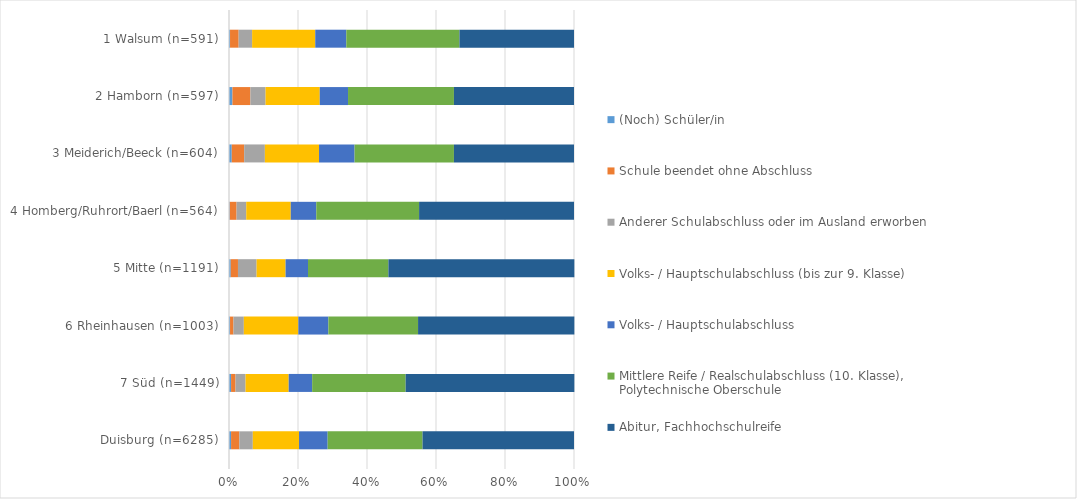
| Category | (Noch) Schüler/in | Schule beendet ohne Abschluss | Anderer Schulabschluss oder im Ausland erworben | Volks- / Hauptschulabschluss (bis zur 9. Klasse) | Volks- / Hauptschulabschluss | Mittlere Reife / Realschulabschluss (10. Klasse), Polytechnische Oberschule | Abitur, Fachhochschulreife |
|---|---|---|---|---|---|---|---|
| Duisburg (n=6285) | 0.006 | 0.024 | 0.039 | 0.134 | 0.083 | 0.275 | 0.439 |
| 7 Süd (n=1449) | 0.006 | 0.013 | 0.029 | 0.125 | 0.068 | 0.271 | 0.489 |
| 6 Rheinhausen (n=1003) | 0.003 | 0.01 | 0.03 | 0.158 | 0.087 | 0.26 | 0.453 |
| 5 Mitte (n=1191) | 0.005 | 0.021 | 0.054 | 0.084 | 0.065 | 0.233 | 0.539 |
| 4 Homberg/Ruhrort/Baerl (n=564) | 0.002 | 0.02 | 0.028 | 0.129 | 0.074 | 0.298 | 0.449 |
| 3 Meiderich/Beeck (n=604) | 0.008 | 0.036 | 0.06 | 0.157 | 0.103 | 0.288 | 0.348 |
| 2 Hamborn (n=597) | 0.01 | 0.052 | 0.044 | 0.157 | 0.082 | 0.307 | 0.348 |
| 1 Walsum (n=591) | 0.003 | 0.025 | 0.039 | 0.183 | 0.09 | 0.328 | 0.332 |